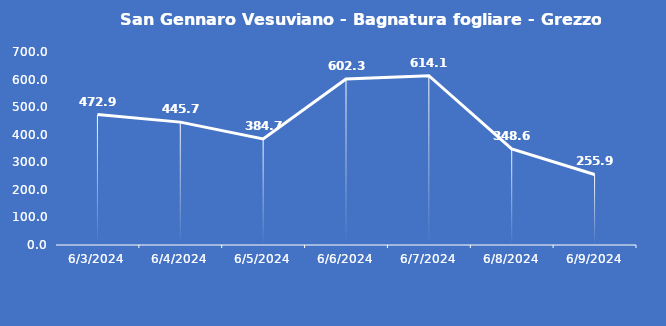
| Category | San Gennaro Vesuviano - Bagnatura fogliare - Grezzo (min) |
|---|---|
| 6/3/24 | 472.9 |
| 6/4/24 | 445.7 |
| 6/5/24 | 384.7 |
| 6/6/24 | 602.3 |
| 6/7/24 | 614.1 |
| 6/8/24 | 348.6 |
| 6/9/24 | 255.9 |